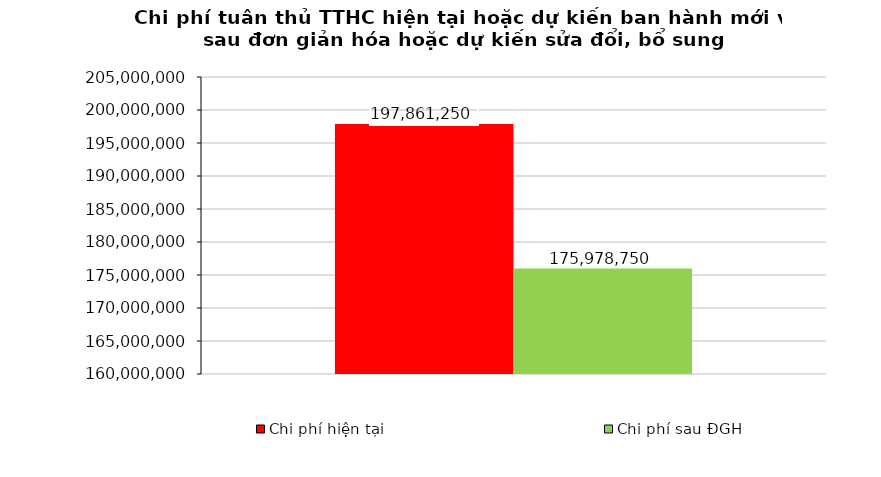
| Category | Chi phí hiện tại | Chi phí sau ĐGH |
|---|---|---|
| 0 | 197861250 | 175978750 |